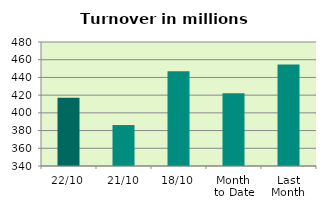
| Category | Series 0 |
|---|---|
| 22/10 | 417.013 |
| 21/10 | 386.25 |
| 18/10 | 446.868 |
| Month 
to Date | 422.055 |
| Last
Month | 454.566 |